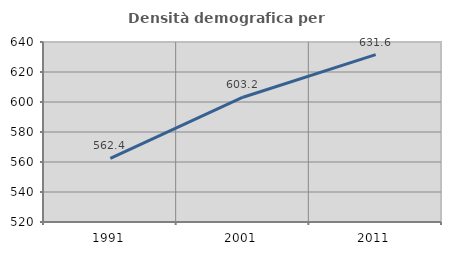
| Category | Densità demografica |
|---|---|
| 1991.0 | 562.354 |
| 2001.0 | 603.195 |
| 2011.0 | 631.57 |